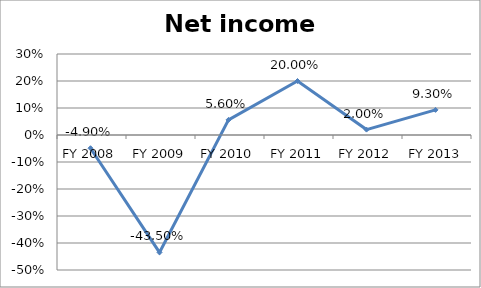
| Category | Net income ratio |
|---|---|
| FY 2013 | 0.093 |
| FY 2012 | 0.02 |
| FY 2011 | 0.2 |
| FY 2010 | 0.056 |
| FY 2009 | -0.435 |
| FY 2008 | -0.049 |